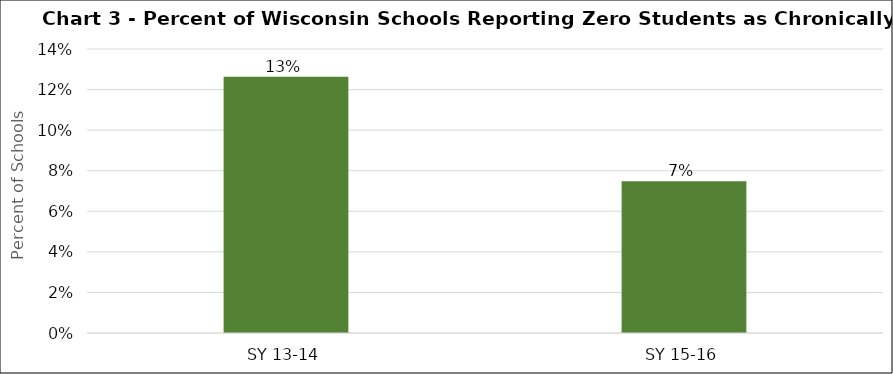
| Category | Series 0 |
|---|---|
| SY 13-14 | 0.126 |
| SY 15-16 | 0.075 |